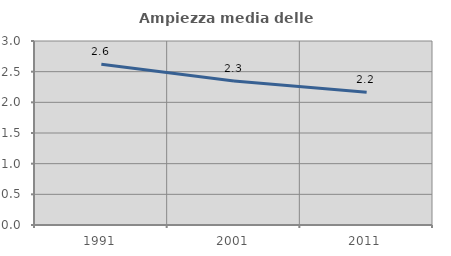
| Category | Ampiezza media delle famiglie |
|---|---|
| 1991.0 | 2.62 |
| 2001.0 | 2.349 |
| 2011.0 | 2.164 |